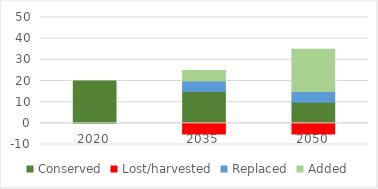
| Category | Conserved | Lost/harvested | Replaced | Added |
|---|---|---|---|---|
| 2020.0 | 20 | 0 | 0 | 0 |
| 2035.0 | 15 | -5 | 5 | 5 |
| 2050.0 | 10 | -5 | 5 | 20 |